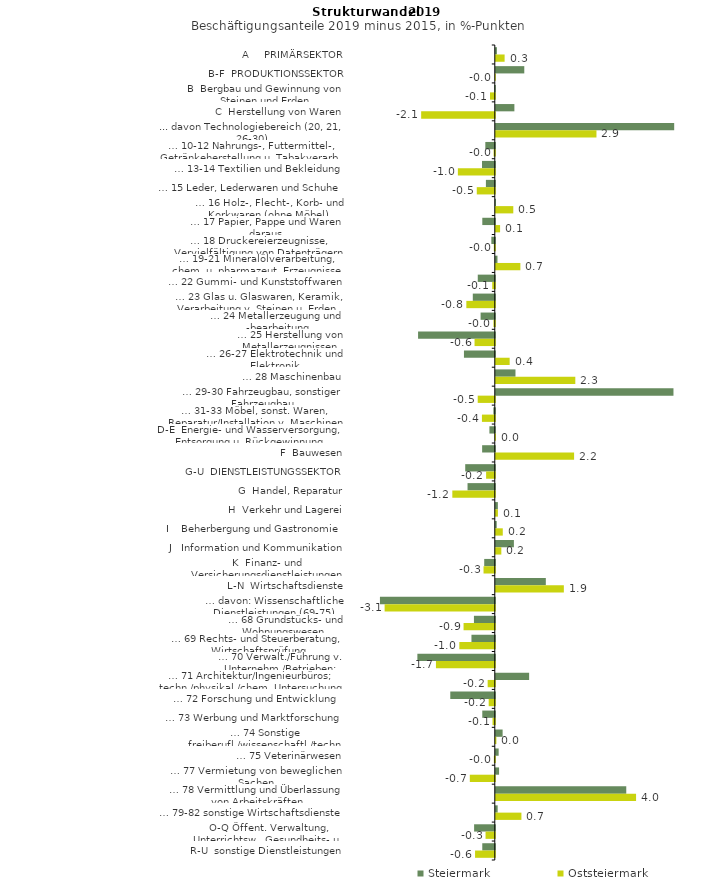
| Category | Steiermark | Oststeiermark |
|---|---|---|
| A     PRIMÄRSEKTOR | 0.031 | 0.25 |
| B-F  PRODUKTIONSSEKTOR | 0.809 | -0.004 |
| B  Bergbau und Gewinnung von Steinen und Erden | -0.014 | -0.136 |
| C  Herstellung von Waren | 0.528 | -2.092 |
| ... davon Technologiebereich (20, 21, 26-30) | 5.068 | 2.86 |
| … 10-12 Nahrungs-, Futtermittel-, Getränkeherstellung u. Tabakverarb. | -0.269 | -0.033 |
| … 13-14 Textilien und Bekleidung | -0.363 | -1.049 |
| … 15 Leder, Lederwaren und Schuhe | -0.253 | -0.512 |
| … 16 Holz-, Flecht-, Korb- und Korkwaren (ohne Möbel)  | 0.005 | 0.497 |
| … 17 Papier, Pappe und Waren daraus  | -0.355 | 0.122 |
| … 18 Druckereierzeugnisse, Vervielfältigung von Datenträgern | -0.098 | -0.028 |
| … 19-21 Mineralölverarbeitung, chem. u. pharmazeut. Erzeugnisse | 0.048 | 0.698 |
| … 22 Gummi- und Kunststoffwaren | -0.484 | -0.073 |
| … 23 Glas u. Glaswaren, Keramik, Verarbeitung v. Steinen u. Erden  | -0.625 | -0.809 |
| … 24 Metallerzeugung und -bearbeitung | -0.403 | -0.038 |
| … 25 Herstellung von Metallerzeugnissen  | -2.18 | -0.575 |
| … 26-27 Elektrotechnik und Elektronik | -0.876 | 0.394 |
| … 28 Maschinenbau | 0.559 | 2.259 |
| … 29-30 Fahrzeugbau, sonstiger Fahrzeugbau | 5.047 | -0.485 |
| … 31-33 Möbel, sonst. Waren, Reparatur/Installation v. Maschinen | -0.041 | -0.366 |
| D-E  Energie- und Wasserversorgung, Entsorgung u. Rückgewinnung | -0.153 | 0.004 |
| F  Bauwesen | -0.36 | 2.224 |
| G-U  DIENSTLEISTUNGSSEKTOR | -0.84 | -0.247 |
| G  Handel, Reparatur | -0.775 | -1.207 |
| H  Verkehr und Lagerei | 0.059 | 0.06 |
| I    Beherbergung und Gastronomie | 0.026 | 0.198 |
| J   Information und Kommunikation | 0.514 | 0.157 |
| K  Finanz- und Versicherungsdienstleistungen | -0.301 | -0.32 |
| L-N  Wirtschaftsdienste | 1.421 | 1.933 |
| … davon: Wissenschaftliche Dienstleistungen (69-75) | -3.263 | -3.13 |
| … 68 Grundstücks- und Wohnungswesen  | -0.593 | -0.888 |
| … 69 Rechts- und Steuerberatung, Wirtschaftsprüfung | -0.663 | -1.007 |
| … 70 Verwalt./Führung v. Unternehm./Betrieben; Unternehmensberat. | -2.199 | -1.672 |
| … 71 Architektur/Ingenieurbüros; techn./physikal./chem. Untersuchung | 0.947 | -0.203 |
| … 72 Forschung und Entwicklung  | -1.265 | -0.174 |
| … 73 Werbung und Marktforschung | -0.356 | -0.064 |
| … 74 Sonstige freiberufl./wissenschaftl./techn. Tätigkeiten | 0.194 | 0.017 |
| … 75 Veterinärwesen | 0.081 | -0.026 |
| … 77 Vermietung von beweglichen Sachen  | 0.093 | -0.71 |
| … 78 Vermittlung und Überlassung von Arbeitskräften | 3.706 | 3.985 |
| … 79-82 sonstige Wirtschaftsdienste | 0.053 | 0.728 |
| O-Q Öffent. Verwaltung, Unterrichtsw., Gesundheits- u. Sozialwesen | -0.588 | -0.263 |
| R-U  sonstige Dienstleistungen | -0.356 | -0.561 |